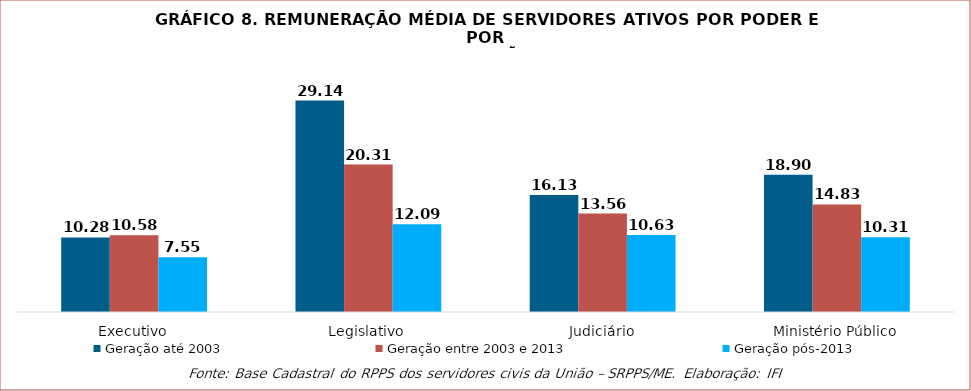
| Category | Geração até 2003 | Geração entre 2003 e 2013 | Geração pós-2013 |
|---|---|---|---|
| Executivo | 10275.574 | 10584.647 | 7554.387 |
| Legislativo | 29137.207 | 20310.591 | 12090.286 |
| Judiciário | 16131.845 | 13560.726 | 10625.956 |
| Ministério Público | 18904.289 | 14826.428 | 10307.437 |